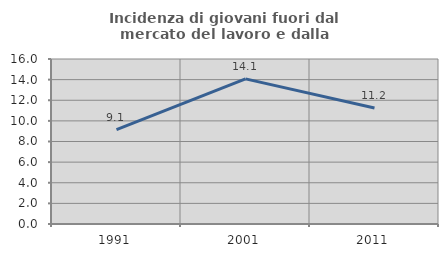
| Category | Incidenza di giovani fuori dal mercato del lavoro e dalla formazione  |
|---|---|
| 1991.0 | 9.143 |
| 2001.0 | 14.073 |
| 2011.0 | 11.243 |